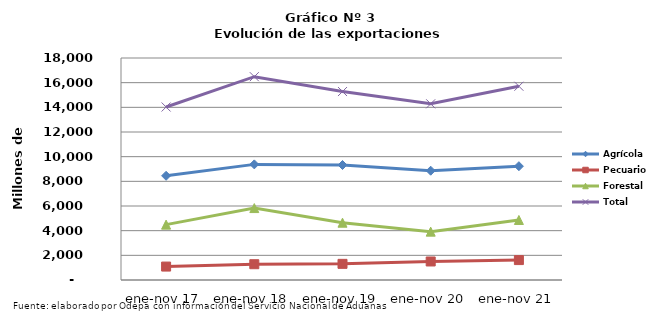
| Category | Agrícola | Pecuario | Forestal | Total |
|---|---|---|---|---|
| ene-nov 17 | 8448657 | 1088304 | 4489789 | 14026750 |
| ene-nov 18 | 9374035 | 1280132 | 5831677 | 16485844 |
| ene-nov 19 | 9324263 | 1309716 | 4646052 | 15280031 |
| ene-nov 20 | 8861322 | 1502350 | 3921879 | 14285551 |
| ene-nov 21 | 9227111 | 1615070 | 4867342 | 15709523 |